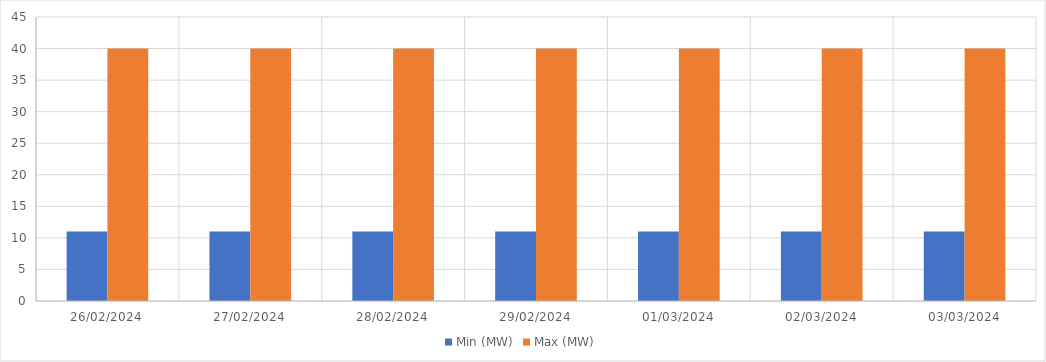
| Category | Min (MW) | Max (MW) |
|---|---|---|
| 26/02/2024 | 11 | 40 |
| 27/02/2024 | 11 | 40 |
| 28/02/2024 | 11 | 40 |
| 29/02/2024 | 11 | 40 |
| 01/03/2024 | 11 | 40 |
| 02/03/2024 | 11 | 40 |
| 03/03/2024 | 11 | 40 |